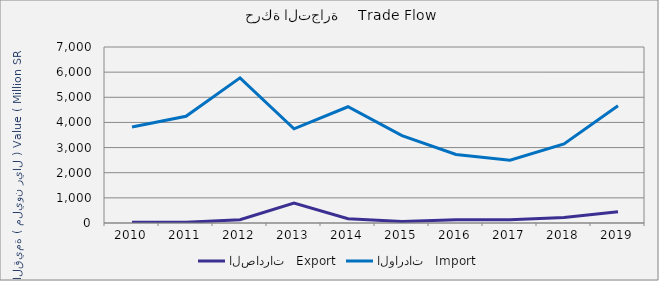
| Category | الصادرات   Export | الواردات   Import |
|---|---|---|
| 2010.0 | 29665498 | 3820730330 |
| 2011.0 | 28622606 | 4244157419 |
| 2012.0 | 131207639 | 5771975719 |
| 2013.0 | 794349838 | 3746034202 |
| 2014.0 | 171050202 | 4623102601 |
| 2015.0 | 59673564 | 3477221985 |
| 2016.0 | 126968795 | 2723338317 |
| 2017.0 | 133116532 | 2495415084 |
| 2018.0 | 214530129 | 3146213284 |
| 2019.0 | 447579922 | 4663523482 |